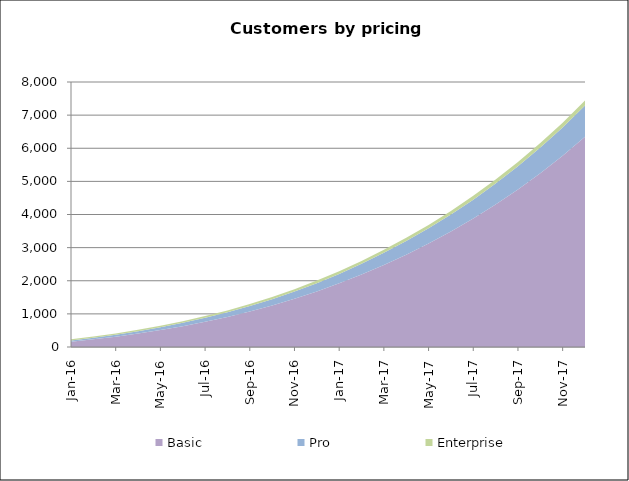
| Category | Basic | Pro | Enterprise |
|---|---|---|---|
| 2016-01-01 | 161 | 38 | 32 |
| 2016-02-01 | 231 | 48 | 35 |
| 2016-03-01 | 312 | 59 | 38 |
| 2016-04-01 | 405 | 72 | 41 |
| 2016-05-01 | 510 | 87 | 44 |
| 2016-06-01 | 628 | 104 | 48 |
| 2016-07-01 | 760 | 121 | 52 |
| 2016-08-01 | 907 | 142 | 56 |
| 2016-09-01 | 1071 | 165 | 61 |
| 2016-10-01 | 1253 | 190 | 66 |
| 2016-11-01 | 1455 | 217 | 72 |
| 2016-12-01 | 1677 | 249 | 78 |
| 2017-01-01 | 1923 | 284 | 82 |
| 2017-02-01 | 2189 | 323 | 87 |
| 2017-03-01 | 2477 | 365 | 92 |
| 2017-04-01 | 2788 | 411 | 97 |
| 2017-05-01 | 3124 | 460 | 102 |
| 2017-06-01 | 3486 | 514 | 108 |
| 2017-07-01 | 3878 | 571 | 114 |
| 2017-08-01 | 4301 | 633 | 121 |
| 2017-09-01 | 4756 | 701 | 128 |
| 2017-10-01 | 5246 | 775 | 135 |
| 2017-11-01 | 5776 | 854 | 143 |
| 2017-12-01 | 6347 | 941 | 152 |